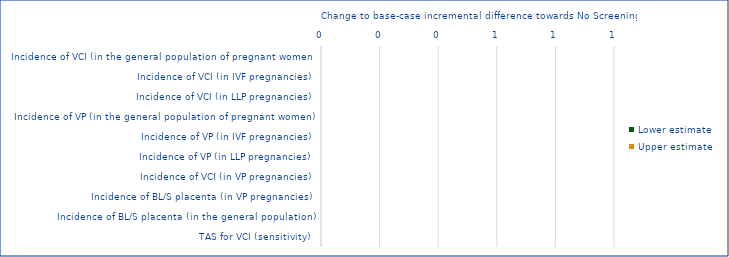
| Category | Lower estimate | Upper estimate |
|---|---|---|
| Incidence of VCI (in the general population of pregnant women) | 0 | 0 |
| Incidence of VCI (in IVF pregnancies) | 0 | 0 |
| Incidence of VCI (in LLP pregnancies) | 0 | 0 |
| Incidence of VP (in the general population of pregnant women) | 0 | 0 |
| Incidence of VP (in IVF pregnancies) | 0 | 0 |
| Incidence of VP (in LLP pregnancies) | 0 | 0 |
| Incidence of VCI (in VP pregnancies) | 0 | 0 |
| Incidence of BL/S placenta (in VP pregnancies) | 0 | 0 |
| Incidence of BL/S placenta (in the general population) | 0 | 0 |
| TAS for VCI (sensitivity) | 0 | 0 |